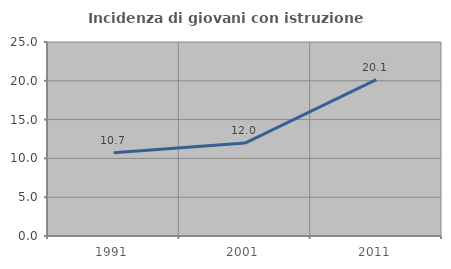
| Category | Incidenza di giovani con istruzione universitaria |
|---|---|
| 1991.0 | 10.714 |
| 2001.0 | 11.979 |
| 2011.0 | 20.149 |